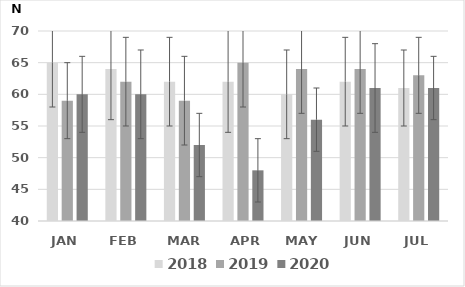
| Category | 2018 | 2019 | 2020 |
|---|---|---|---|
| JAN | 65 | 59 | 60 |
| FEB | 64 | 62 | 60 |
| MAR | 62 | 59 | 52 |
| APR | 62 | 65 | 48 |
| MAY | 60 | 64 | 56 |
| JUN | 62 | 64 | 61 |
| JUL | 61 | 63 | 61 |